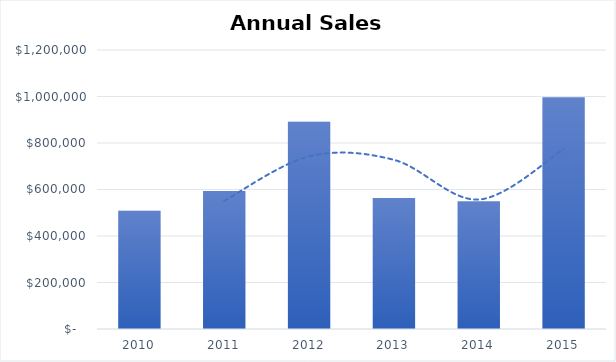
| Category | Total Sales |
|---|---|
| 2010.0 | 508791.11 |
| 2011.0 | 593672.3 |
| 2012.0 | 891412.17 |
| 2013.0 | 563846.64 |
| 2014.0 | 549704.29 |
| 2015.0 | 997151.59 |